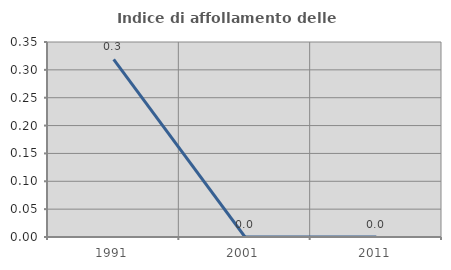
| Category | Indice di affollamento delle abitazioni  |
|---|---|
| 1991.0 | 0.319 |
| 2001.0 | 0 |
| 2011.0 | 0 |